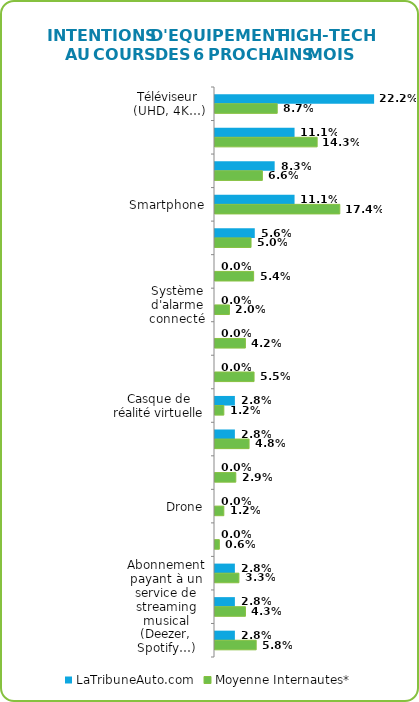
| Category | LaTribuneAuto.com | Moyenne Internautes* |
|---|---|---|
| Téléviseur (UHD, 4K…) | 0.222 | 0.087 |
| Ordinateur (portable ou de bureau) | 0.111 | 0.143 |
| Tablette | 0.083 | 0.066 |
| Smartphone | 0.111 | 0.174 |
| Montre connectée | 0.056 | 0.05 |
| Console de jeux | 0 | 0.054 |
| Système d'alarme connecté | 0 | 0.02 |
| Forfait mobile 4G | 0 | 0.042 |
| Casque audio | 0 | 0.055 |
| Casque de réalité virtuelle | 0.028 | 0.012 |
| Enceinte, station d'écoute, barre de son… | 0.028 | 0.048 |
| Enceinte intelligente à commande vocale (Amazon Echo, Apple HomePod, Google Home…) | 0 | 0.029 |
| Drone | 0 | 0.012 |
| Hoverboard, gyropode ou gyroroue | 0 | 0.006 |
| Trottinette électrique | 0.028 | 0.033 |
| Abonnement payant à un service de streaming musical (Deezer, Spotify…) | 0.028 | 0.043 |
| Abonnement payant à un service de streaming vidéo (Canalplay, Netflix…) | 0.028 | 0.058 |